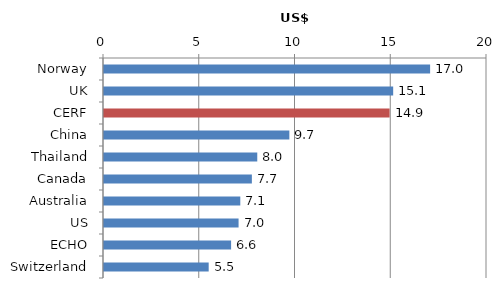
| Category | US$m |
|---|---|
| Norway | 17.029 |
| UK | 15.101 |
| CERF | 14.914 |
| China | 9.679 |
| Thailand | 8.003 |
| Canada | 7.722 |
| Australia | 7.117 |
| US | 7.028 |
| ECHO | 6.637 |
| Switzerland | 5.467 |